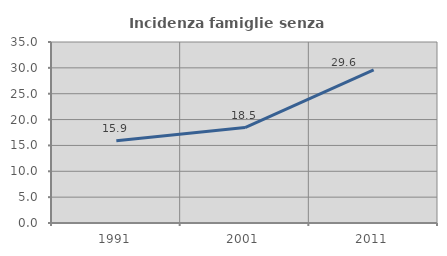
| Category | Incidenza famiglie senza nuclei |
|---|---|
| 1991.0 | 15.923 |
| 2001.0 | 18.462 |
| 2011.0 | 29.622 |